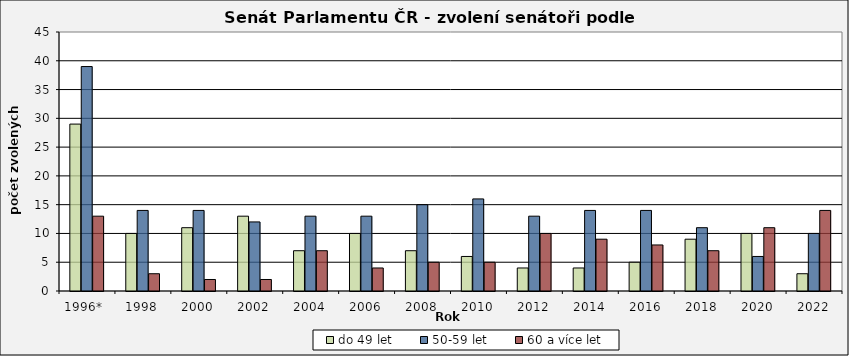
| Category | do 49 let | 50-59 let | 60 a více let |
|---|---|---|---|
| 1996*  | 29 | 39 | 13 |
| 1998 | 10 | 14 | 3 |
| 2000 | 11 | 14 | 2 |
| 2002 | 13 | 12 | 2 |
| 2004 | 7 | 13 | 7 |
| 2006 | 10 | 13 | 4 |
| 2008 | 7 | 15 | 5 |
| 2010 | 6 | 16 | 5 |
| 2012 | 4 | 13 | 10 |
| 2014 | 4 | 14 | 9 |
| 2016 | 5 | 14 | 8 |
| 2018 | 9 | 11 | 7 |
| 2020 | 10 | 6 | 11 |
| 2022 | 3 | 10 | 14 |